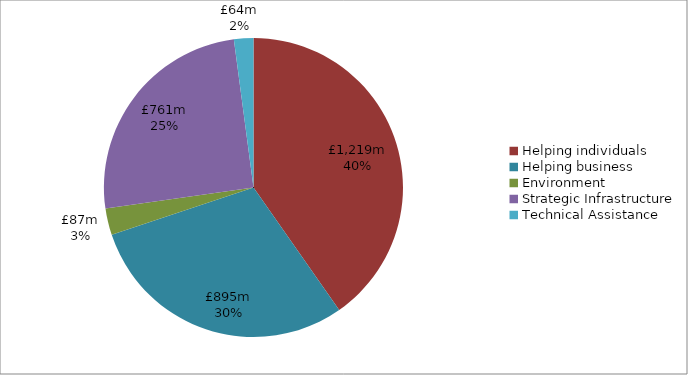
| Category | Series 0 | Series 1 |
|---|---|---|
| Helping individuals | 1219.29 |  |
| Helping business | 895.451 |  |
| Environment | 87.44 |  |
| Strategic Infrastructure | 760.803 |  |
| Technical Assistance | 63.612 |  |